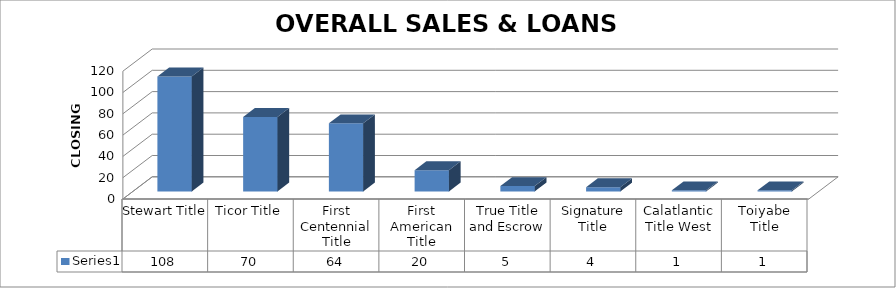
| Category | Series 0 |
|---|---|
| Stewart Title | 108 |
| Ticor Title | 70 |
| First Centennial Title | 64 |
| First American Title | 20 |
| True Title and Escrow | 5 |
| Signature Title | 4 |
| Calatlantic Title West | 1 |
| Toiyabe Title | 1 |